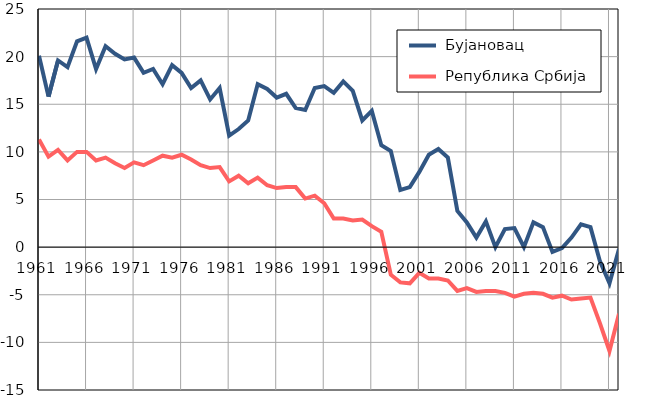
| Category |  Бујановац |  Република Србија |
|---|---|---|
| 1961.0 | 20.1 | 11.3 |
| 1962.0 | 15.8 | 9.5 |
| 1963.0 | 19.6 | 10.2 |
| 1964.0 | 18.9 | 9.1 |
| 1965.0 | 21.6 | 10 |
| 1966.0 | 22 | 10 |
| 1967.0 | 18.7 | 9.1 |
| 1968.0 | 21.1 | 9.4 |
| 1969.0 | 20.3 | 8.8 |
| 1970.0 | 19.7 | 8.3 |
| 1971.0 | 19.9 | 8.9 |
| 1972.0 | 18.3 | 8.6 |
| 1973.0 | 18.7 | 9.1 |
| 1974.0 | 17.1 | 9.6 |
| 1975.0 | 19.1 | 9.4 |
| 1976.0 | 18.3 | 9.7 |
| 1977.0 | 16.7 | 9.2 |
| 1978.0 | 17.5 | 8.6 |
| 1979.0 | 15.5 | 8.3 |
| 1980.0 | 16.7 | 8.4 |
| 1981.0 | 11.7 | 6.9 |
| 1982.0 | 12.4 | 7.5 |
| 1983.0 | 13.3 | 6.7 |
| 1984.0 | 17.1 | 7.3 |
| 1985.0 | 16.6 | 6.5 |
| 1986.0 | 15.7 | 6.2 |
| 1987.0 | 16.1 | 6.3 |
| 1988.0 | 14.6 | 6.3 |
| 1989.0 | 14.4 | 5.1 |
| 1990.0 | 16.7 | 5.4 |
| 1991.0 | 16.9 | 4.6 |
| 1992.0 | 16.2 | 3 |
| 1993.0 | 17.4 | 3 |
| 1994.0 | 16.4 | 2.8 |
| 1995.0 | 13.3 | 2.9 |
| 1996.0 | 14.3 | 2.2 |
| 1997.0 | 10.7 | 1.6 |
| 1998.0 | 10.1 | -2.9 |
| 1999.0 | 6 | -3.7 |
| 2000.0 | 6.3 | -3.8 |
| 2001.0 | 7.9 | -2.7 |
| 2002.0 | 9.7 | -3.3 |
| 2003.0 | 10.3 | -3.3 |
| 2004.0 | 9.4 | -3.5 |
| 2005.0 | 3.8 | -4.6 |
| 2006.0 | 2.6 | -4.3 |
| 2007.0 | 1 | -4.7 |
| 2008.0 | 2.7 | -4.6 |
| 2009.0 | 0 | -4.6 |
| 2010.0 | 1.9 | -4.8 |
| 2011.0 | 2 | -5.2 |
| 2012.0 | 0 | -4.9 |
| 2013.0 | 2.6 | -4.8 |
| 2014.0 | 2.1 | -4.9 |
| 2015.0 | -0.5 | -5.3 |
| 2016.0 | -0.1 | -5.1 |
| 2017.0 | 1 | -5.5 |
| 2018.0 | 2.4 | -5.4 |
| 2019.0 | 2.1 | -5.3 |
| 2020.0 | -1.5 | -8 |
| 2021.0 | -3.8 | -10.9 |
| 2022.0 | -0.2 | -7 |